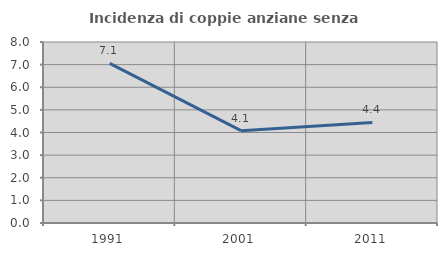
| Category | Incidenza di coppie anziane senza figli  |
|---|---|
| 1991.0 | 7.059 |
| 2001.0 | 4.082 |
| 2011.0 | 4.444 |